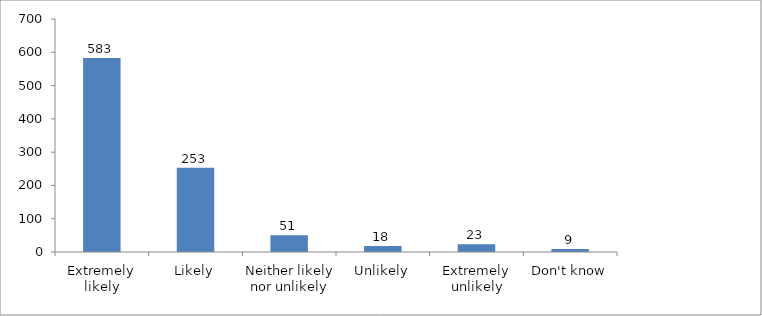
| Category | Series 0 |
|---|---|
| Extremely likely | 583 |
| Likely | 253 |
| Neither likely nor unlikely | 50 |
| Unlikely | 18 |
| Extremely unlikely | 23 |
| Don't know | 9 |